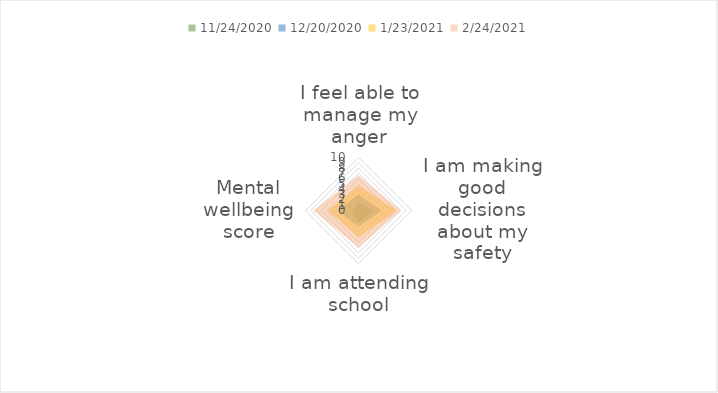
| Category | 24/11/2020 | 20/12/2020 | 23/01/2021 | 24/02/2021 |
|---|---|---|---|---|
| I feel able to manage my anger | 1.6 | 3 | 4.7 | 6.6 |
| I am making good decisions about my safety | 3.1 | 4.3 | 7.2 | 8 |
| I am attending school | 2.3 | 3 | 5.1 | 7 |
| Mental wellbeing score | 1.1 | 4 | 5.8 | 8.5 |